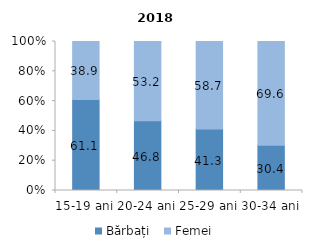
| Category | Bărbați  | Femei |
|---|---|---|
| 15-19 ani | 61.1 | 38.9 |
| 20-24 ani | 46.8 | 53.2 |
| 25-29 ani | 41.3 | 58.7 |
| 30-34 ani | 30.4 | 69.6 |